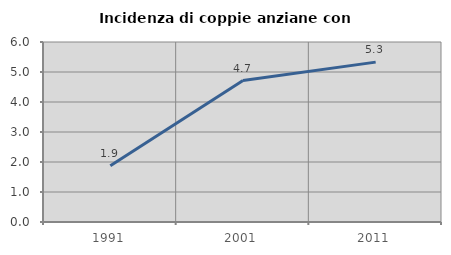
| Category | Incidenza di coppie anziane con figli |
|---|---|
| 1991.0 | 1.878 |
| 2001.0 | 4.716 |
| 2011.0 | 5.329 |